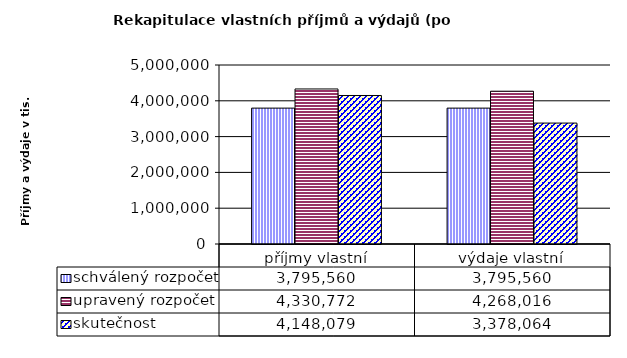
| Category | schválený rozpočet | upravený rozpočet | skutečnost |
|---|---|---|---|
| příjmy vlastní | 3795560 | 4330772 | 4148079 |
| výdaje vlastní | 3795560 | 4268016 | 3378064 |